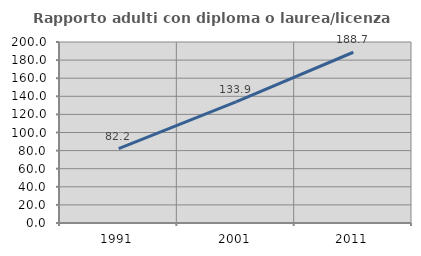
| Category | Rapporto adulti con diploma o laurea/licenza media  |
|---|---|
| 1991.0 | 82.209 |
| 2001.0 | 133.871 |
| 2011.0 | 188.67 |